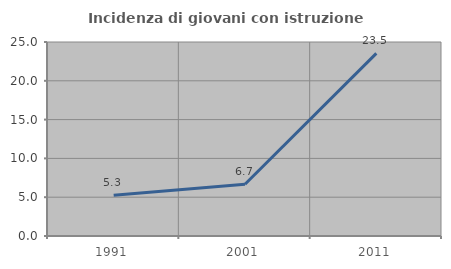
| Category | Incidenza di giovani con istruzione universitaria |
|---|---|
| 1991.0 | 5.263 |
| 2001.0 | 6.667 |
| 2011.0 | 23.529 |